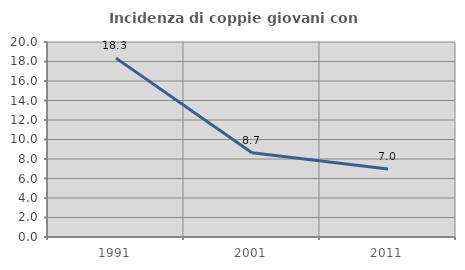
| Category | Incidenza di coppie giovani con figli |
|---|---|
| 1991.0 | 18.348 |
| 2001.0 | 8.651 |
| 2011.0 | 6.98 |